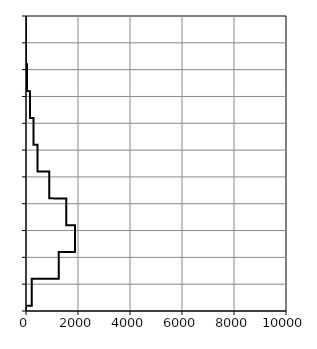
| Category | Femmes |
|---|---|
| 0.0 | 15 |
| 0.0 | 15.99 |
| 219.8 | 16 |
| 219.8 | 17 |
| 219.8 | 18 |
| 219.8 | 19 |
| 219.8 | 20.99 |
| 1258.2 | 21 |
| 1258.2 | 22 |
| 1258.2 | 23 |
| 1258.2 | 24 |
| 1258.2 | 25.99 |
| 1882.0 | 26 |
| 1882.0 | 27 |
| 1882.0 | 28 |
| 1882.0 | 29 |
| 1882.0 | 30.99 |
| 1549.2 | 31 |
| 1549.2 | 32 |
| 1549.2 | 33 |
| 1549.2 | 34 |
| 1549.2 | 35.99 |
| 889.8 | 36 |
| 889.8 | 37 |
| 889.8 | 38 |
| 889.8 | 39 |
| 889.8 | 40.99 |
| 446.8 | 41 |
| 446.8 | 42 |
| 446.8 | 43 |
| 446.8 | 44 |
| 446.8 | 45.99 |
| 291.8 | 46 |
| 291.8 | 47 |
| 291.8 | 48 |
| 291.8 | 49 |
| 291.8 | 50.99 |
| 156.2 | 51 |
| 156.2 | 52 |
| 156.2 | 53 |
| 156.2 | 54 |
| 156.2 | 55.99 |
| 40.4 | 56 |
| 40.4 | 57 |
| 40.4 | 58 |
| 40.4 | 59 |
| 40.4 | 60.99 |
| 1.8 | 61 |
| 1.8 | 62 |
| 1.8 | 63 |
| 1.8 | 64 |
| 1.8 | 65.99 |
| 1.0 | 66 |
| 1.0 | 67 |
| 1.0 | 68 |
| 1.0 | 69 |
| 1.0 | 70 |